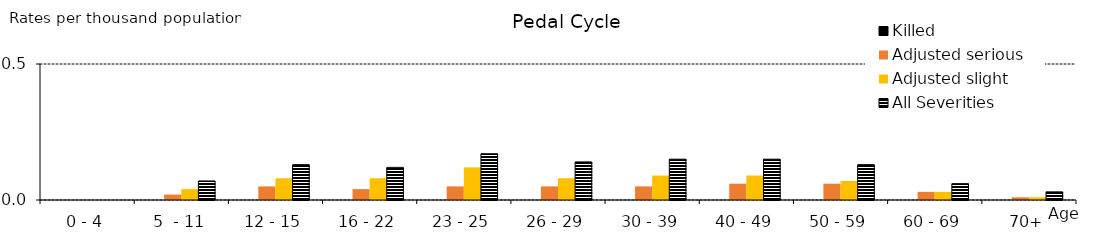
| Category | Killed | Adjusted serious | Adjusted slight | All Severities |
|---|---|---|---|---|
| 0 - 4 | 0 | 0 | 0 | 0 |
| 5  - 11 | 0 | 0.02 | 0.04 | 0.07 |
| 12 - 15 | 0 | 0.05 | 0.08 | 0.13 |
| 16 - 22 | 0 | 0.04 | 0.08 | 0.12 |
| 23 - 25 | 0 | 0.05 | 0.12 | 0.17 |
| 26 - 29 | 0 | 0.05 | 0.08 | 0.14 |
| 30 - 39 | 0 | 0.05 | 0.09 | 0.15 |
| 40 - 49 | 0 | 0.06 | 0.09 | 0.15 |
| 50 - 59 | 0 | 0.06 | 0.07 | 0.13 |
| 60 - 69 | 0 | 0.03 | 0.03 | 0.06 |
| 70+ | 0 | 0.01 | 0.01 | 0.03 |